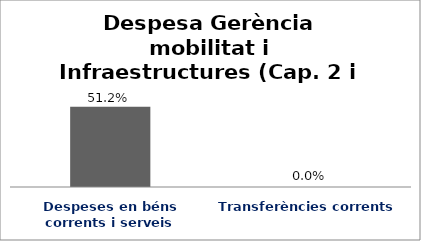
| Category | Series 0 |
|---|---|
| Despeses en béns corrents i serveis | 0.512 |
| Transferències corrents | 0 |